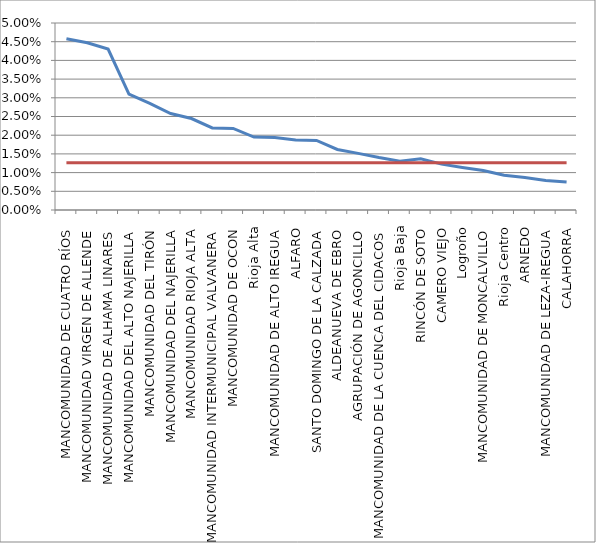
| Category | Series 0 | Series 1 |
|---|---|---|
| MANCOMUNIDAD DE CUATRO RÍOS | 0.046 | 0.013 |
| MANCOMUNIDAD VIRGEN DE ALLENDE | 0.045 | 0.013 |
| MANCOMUNIDAD DE ALHAMA LINARES | 0.043 | 0.013 |
| MANCOMUNIDAD DEL ALTO NAJERILLA | 0.031 | 0.013 |
| MANCOMUNIDAD DEL TIRÓN | 0.028 | 0.013 |
| MANCOMUNIDAD DEL NAJERILLA | 0.026 | 0.013 |
| MANCOMUNIDAD RIOJA ALTA | 0.024 | 0.013 |
| MANCOMUNIDAD INTERMUNICIPAL VALVANERA | 0.022 | 0.013 |
| MANCOMUNIDAD DE OCON | 0.022 | 0.013 |
| Rioja Alta | 0.02 | 0.013 |
| MANCOMUNIDAD DE ALTO IREGUA | 0.019 | 0.013 |
| ALFARO | 0.019 | 0.013 |
| SANTO DOMINGO DE LA CALZADA | 0.019 | 0.013 |
| ALDEANUEVA DE EBRO | 0.016 | 0.013 |
| AGRUPACIÓN DE AGONCILLO | 0.015 | 0.013 |
| MANCOMUNIDAD DE LA CUENCA DEL CIDACOS | 0.014 | 0.013 |
| Rioja Baja | 0.013 | 0.013 |
| RINCÓN DE SOTO | 0.014 | 0.013 |
| CAMERO VIEJO | 0.012 | 0.013 |
| Logroño | 0.011 | 0.013 |
| MANCOMUNIDAD DE MONCALVILLO | 0.011 | 0.013 |
| Rioja Centro | 0.009 | 0.013 |
| ARNEDO | 0.009 | 0.013 |
| MANCOMUNIDAD DE LEZA-IREGUA | 0.008 | 0.013 |
| CALAHORRA | 0.007 | 0.013 |